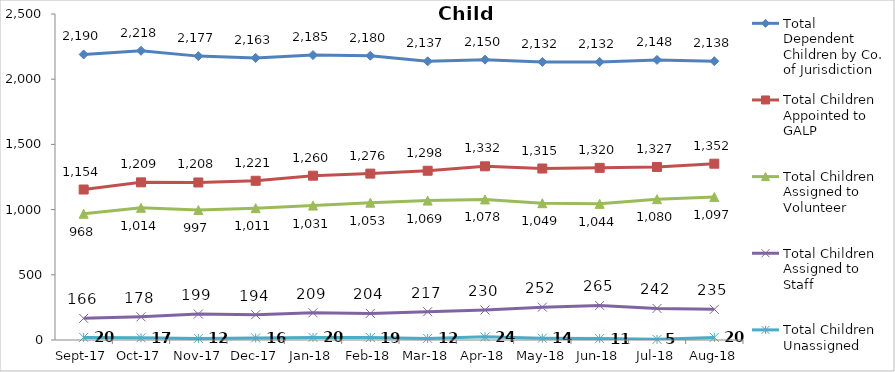
| Category | Total Dependent Children by Co. of Jurisdiction | Total Children Appointed to GALP | Total Children Assigned to Volunteer | Total Children Assigned to Staff | Total Children Unassigned |
|---|---|---|---|---|---|
| 2017-09-01 | 2190 | 1154 | 968 | 166 | 20 |
| 2017-10-01 | 2218 | 1209 | 1014 | 178 | 17 |
| 2017-11-01 | 2177 | 1208 | 997 | 199 | 12 |
| 2017-12-01 | 2163 | 1221 | 1011 | 194 | 16 |
| 2018-01-01 | 2185 | 1260 | 1031 | 209 | 20 |
| 2018-02-01 | 2180 | 1276 | 1053 | 204 | 19 |
| 2018-03-01 | 2137 | 1298 | 1069 | 217 | 12 |
| 2018-04-01 | 2150 | 1332 | 1078 | 230 | 24 |
| 2018-05-01 | 2132 | 1315 | 1049 | 252 | 14 |
| 2018-06-01 | 2132 | 1320 | 1044 | 265 | 11 |
| 2018-07-01 | 2148 | 1327 | 1080 | 242 | 5 |
| 2018-08-01 | 2138 | 1352 | 1097 | 235 | 20 |